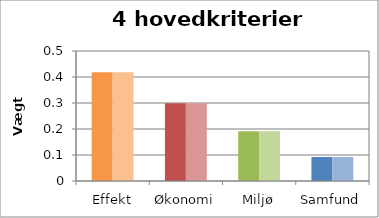
| Category | Vægt 1 | Vægt 2 |
|---|---|---|
| Effekt | 0.418 | 0.418 |
| Økonomi | 0.299 | 0.299 |
| Miljø | 0.191 | 0.191 |
| Samfund | 0.092 | 0.092 |